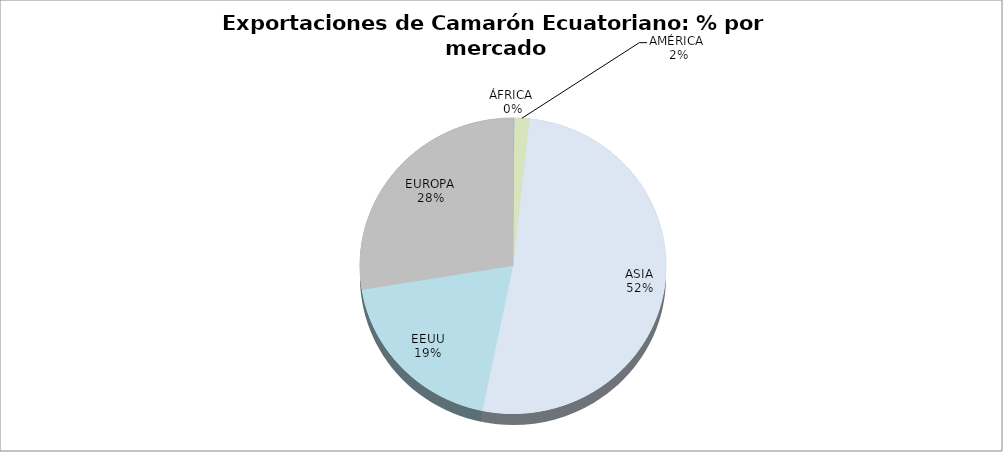
| Category | Series 0 |
|---|---|
| ÁFRICA  | 0.001 |
| AMÉRICA  | 0.016 |
| ASIA | 0.515 |
| EEUU | 0.192 |
| EUROPA | 0.276 |